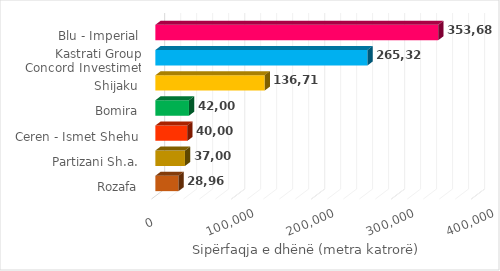
| Category | Sipërfaqja e dhënë për shfrytëzim (metër katror) |
|---|---|
| Rozafa | 28960 |
| Partizani Sh.a. | 37000 |
| Ceren - Ismet Shehu | 40000 |
| Bomira | 42009 |
| Shijaku | 136716 |
| Kastrati Group
Concord Investimet | 265319.5 |
| Blu - Imperial | 353686 |